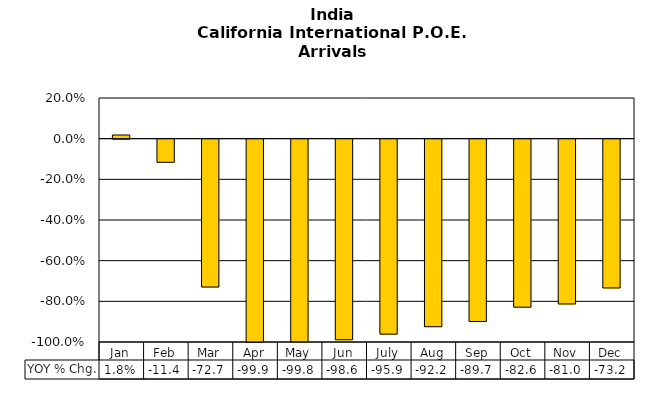
| Category | YOY % Chg. |
|---|---|
| Jan | 0.018 |
| Feb | -0.114 |
| Mar | -0.727 |
| Apr | -0.999 |
| May | -0.998 |
| Jun | -0.986 |
| July | -0.959 |
| Aug | -0.922 |
| Sep | -0.897 |
| Oct | -0.826 |
| Nov | -0.81 |
| Dec | -0.732 |